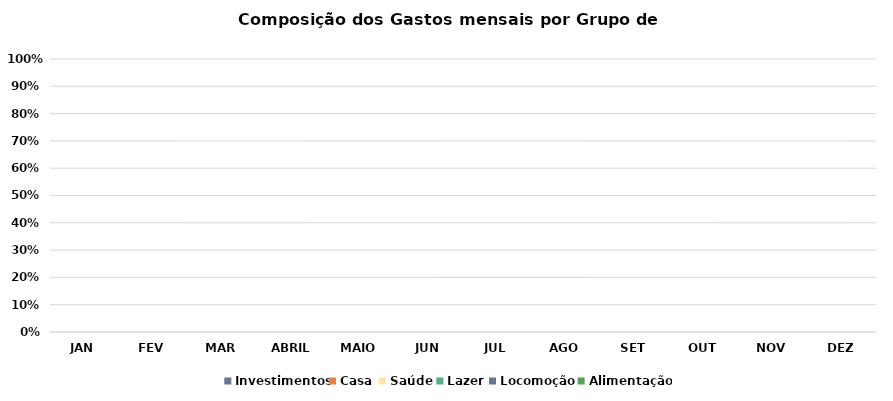
| Category | Investimentos | Casa | Saúde | Lazer | Locomoção | Alimentação |
|---|---|---|---|---|---|---|
| JAN | 0 | 0 | 0 | 0 | 0 | 0 |
| FEV | 0 | 0 | 0 | 0 | 0 | 0 |
| MAR | 0 | 0 | 0 | 0 | 0 | 0 |
| ABRIL | 0 | 0 | 0 | 0 | 0 | 0 |
| MAIO | 0 | 0 | 0 | 0 | 0 | 0 |
| JUN | 0 | 0 | 0 | 0 | 0 | 0 |
| JUL | 0 | 0 | 0 | 0 | 0 | 0 |
| AGO | 0 | 0 | 0 | 0 | 0 | 0 |
| SET | 0 | 0 | 0 | 0 | 0 | 0 |
| OUT | 0 | 0 | 0 | 0 | 0 | 0 |
| NOV | 0 | 0 | 0 | 0 | 0 | 0 |
| DEZ | 0 | 0 | 0 | 0 | 0 | 0 |